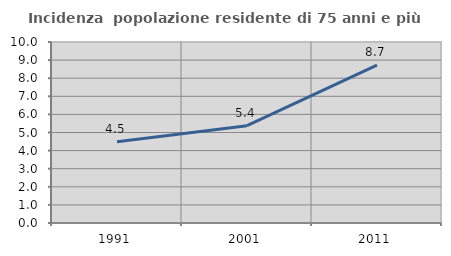
| Category | Incidenza  popolazione residente di 75 anni e più |
|---|---|
| 1991.0 | 4.484 |
| 2001.0 | 5.379 |
| 2011.0 | 8.717 |